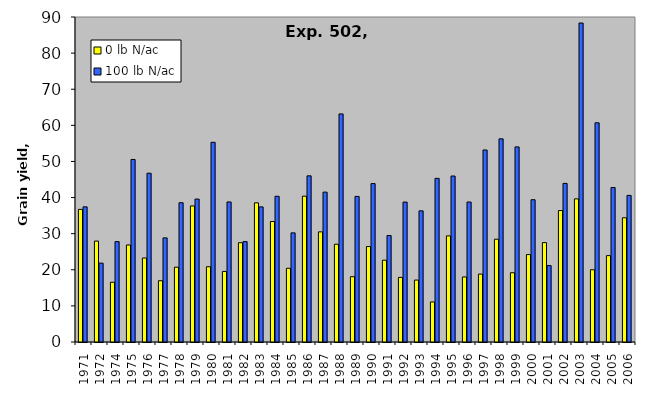
| Category | 0 lb N/ac | 100 lb N/ac |
|---|---|---|
| 1971.0 | 36.725 | 37.425 |
| 1972.0 | 27.95 | 21.84 |
| 1974.0 | 16.547 | 27.8 |
| 1975.0 | 26.862 | 50.548 |
| 1976.0 | 23.262 | 46.736 |
| 1977.0 | 16.97 | 28.828 |
| 1978.0 | 20.721 | 38.569 |
| 1979.0 | 37.675 | 39.582 |
| 1980.0 | 20.842 | 55.298 |
| 1981.0 | 19.542 | 38.782 |
| 1982.0 | 27.498 | 27.8 |
| 1983.0 | 38.538 | 37.418 |
| 1984.0 | 33.365 | 40.35 |
| 1985.0 | 20.418 | 30.22 |
| 1986.0 | 40.382 | 46.01 |
| 1987.0 | 30.492 | 41.502 |
| 1988.0 | 27.072 | 63.16 |
| 1989.0 | 18.09 | 40.322 |
| 1990.0 | 26.438 | 43.862 |
| 1991.0 | 22.655 | 29.49 |
| 1992.0 | 17.89 | 38.747 |
| 1993.0 | 17.152 | 36.318 |
| 1994.0 | 11.093 | 45.314 |
| 1995.0 | 29.386 | 45.956 |
| 1996.0 | 18.014 | 38.763 |
| 1997.0 | 18.808 | 53.168 |
| 1998.0 | 28.464 | 56.252 |
| 1999.0 | 19.184 | 54.027 |
| 2000.0 | 24.207 | 39.397 |
| 2001.0 | 27.522 | 21.164 |
| 2002.0 | 36.399 | 43.916 |
| 2003.0 | 39.634 | 88.329 |
| 2004.0 | 20 | 60.7 |
| 2005.0 | 23.917 | 42.78 |
| 2006.0 | 34.4 | 40.6 |